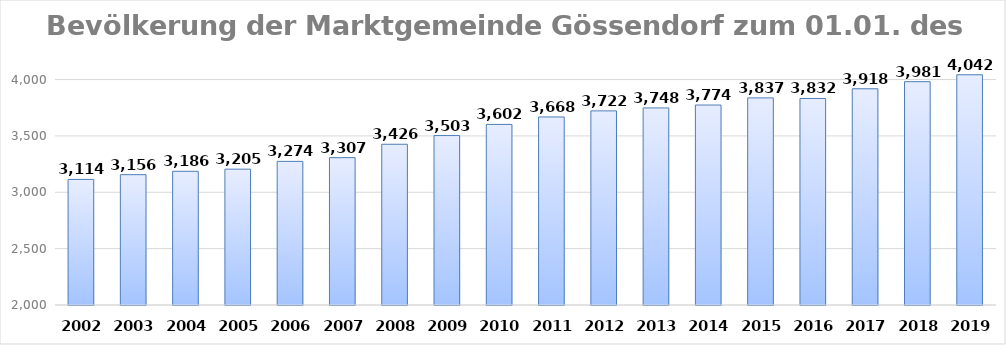
| Category | Series 0 |
|---|---|
| 2002.0 | 3114 |
| 2003.0 | 3156 |
| 2004.0 | 3186 |
| 2005.0 | 3205 |
| 2006.0 | 3274 |
| 2007.0 | 3307 |
| 2008.0 | 3426 |
| 2009.0 | 3503 |
| 2010.0 | 3602 |
| 2011.0 | 3668 |
| 2012.0 | 3722 |
| 2013.0 | 3748 |
| 2014.0 | 3774 |
| 2015.0 | 3837 |
| 2016.0 | 3832 |
| 2017.0 | 3918 |
| 2018.0 | 3981 |
| 2019.0 | 4042 |